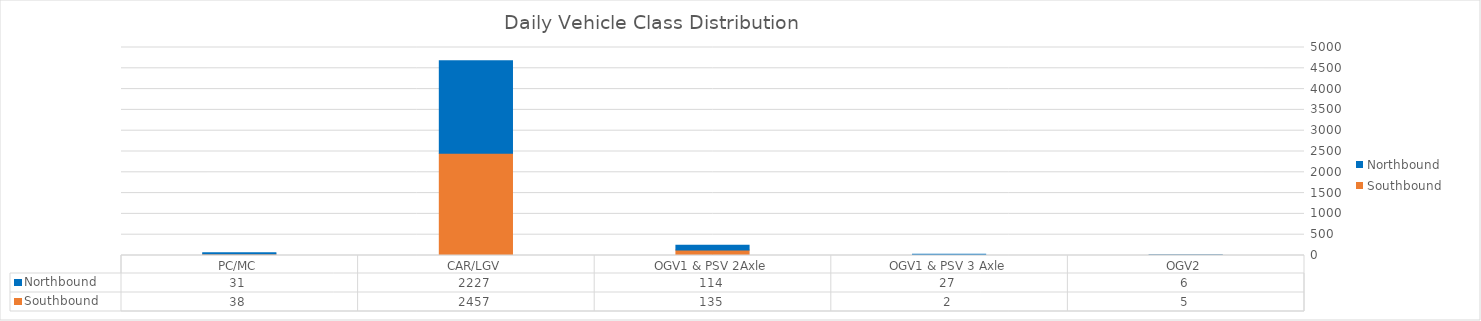
| Category | Southbound | Northbound |
|---|---|---|
| PC/MC | 38 | 31 |
| CAR/LGV | 2457 | 2227 |
| OGV1 & PSV 2Axle | 135 | 114 |
| OGV1 & PSV 3 Axle | 2 | 27 |
| OGV2 | 5 | 6 |